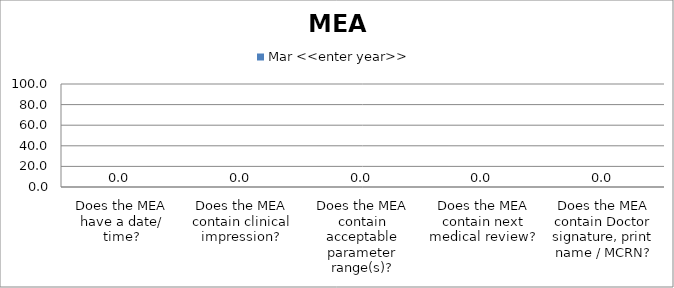
| Category | Mar <<enter year>> |
|---|---|
| Does the MEA have a date/ time? | 0 |
| Does the MEA contain clinical impression? | 0 |
| Does the MEA contain acceptable parameter range(s)? | 0 |
| Does the MEA contain next medical review? | 0 |
| Does the MEA contain Doctor signature, print name / MCRN? | 0 |